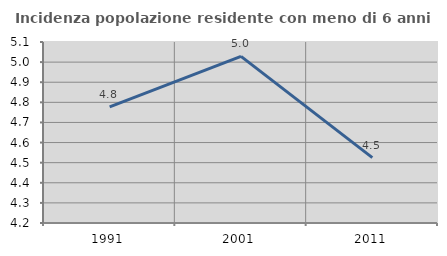
| Category | Incidenza popolazione residente con meno di 6 anni |
|---|---|
| 1991.0 | 4.777 |
| 2001.0 | 5.029 |
| 2011.0 | 4.525 |